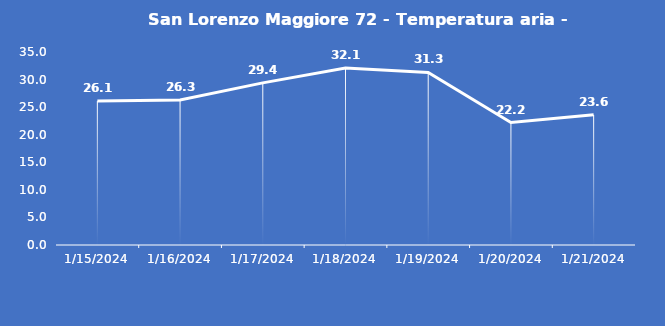
| Category | San Lorenzo Maggiore 72 - Temperatura aria - Grezzo (°C) |
|---|---|
| 1/15/24 | 26.1 |
| 1/16/24 | 26.3 |
| 1/17/24 | 29.4 |
| 1/18/24 | 32.1 |
| 1/19/24 | 31.3 |
| 1/20/24 | 22.2 |
| 1/21/24 | 23.6 |